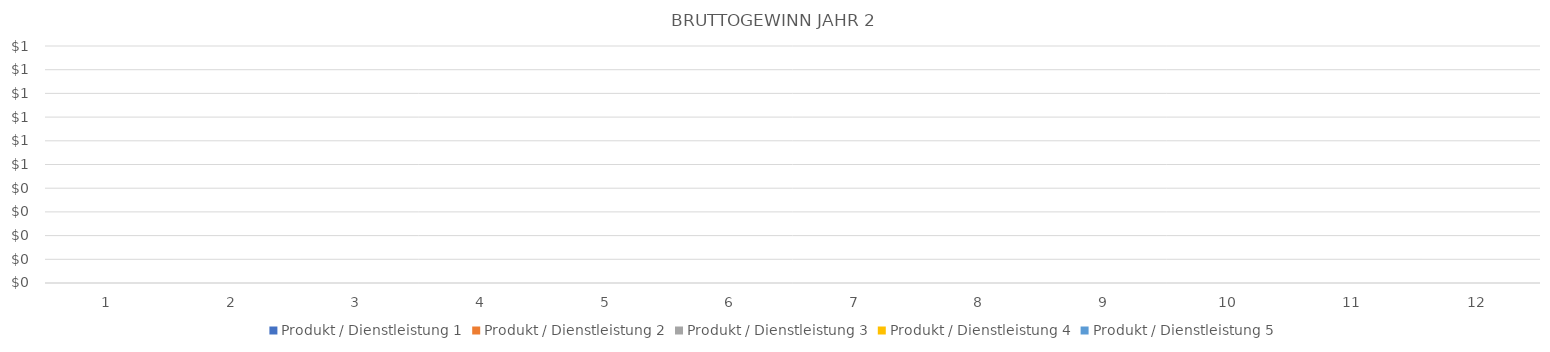
| Category | Produkt / Dienstleistung 1 | Produkt / Dienstleistung 2 | Produkt / Dienstleistung 3 | Produkt / Dienstleistung 4 | Produkt / Dienstleistung 5 |
|---|---|---|---|---|---|
| 0 | 0 | 0 | 0 | 0 | 0 |
| 1 | 0 | 0 | 0 | 0 | 0 |
| 2 | 0 | 0 | 0 | 0 | 0 |
| 3 | 0 | 0 | 0 | 0 | 0 |
| 4 | 0 | 0 | 0 | 0 | 0 |
| 5 | 0 | 0 | 0 | 0 | 0 |
| 6 | 0 | 0 | 0 | 0 | 0 |
| 7 | 0 | 0 | 0 | 0 | 0 |
| 8 | 0 | 0 | 0 | 0 | 0 |
| 9 | 0 | 0 | 0 | 0 | 0 |
| 10 | 0 | 0 | 0 | 0 | 0 |
| 11 | 0 | 0 | 0 | 0 | 0 |